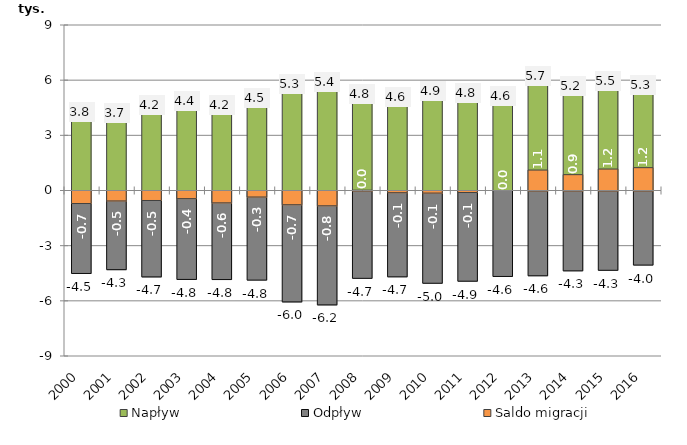
| Category | Napływ | Odpływ | Saldo migracji |
|---|---|---|---|
| 2000.0 | 3804 | -4485 | -681 |
| 2001.0 | 3738 | -4277 | -539 |
| 2002.0 | 4155 | -4671 | -516 |
| 2003.0 | 4394 | -4809 | -415 |
| 2004.0 | 4172 | -4816 | -644 |
| 2005.0 | 4520 | -4846 | -326 |
| 2006.0 | 5286 | -6032 | -746 |
| 2007.0 | 5390 | -6193 | -803 |
| 2008.0 | 4767 | -4749 | 18 |
| 2009.0 | 4577 | -4669 | -92 |
| 2010.0 | 4905 | -5017 | -112 |
| 2011.0 | 4822 | -4905 | -83 |
| 2012.0 | 4647 | -4647 | 0 |
| 2013.0 | 5723 | -4611 | 1112 |
| 2014.0 | 5204 | -4343 | 861 |
| 2015.0 | 5480 | -4313 | 1167 |
| 2016.0 | 5271 | -4029 | 1242 |